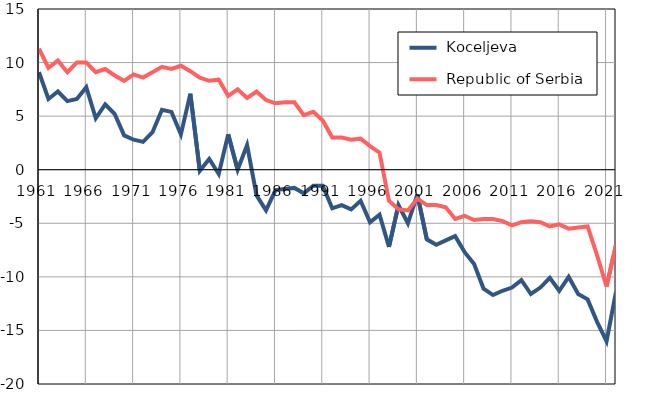
| Category |  Koceljeva |  Republic of Serbia |
|---|---|---|
| 1961.0 | 9.1 | 11.3 |
| 1962.0 | 6.6 | 9.5 |
| 1963.0 | 7.3 | 10.2 |
| 1964.0 | 6.4 | 9.1 |
| 1965.0 | 6.6 | 10 |
| 1966.0 | 7.7 | 10 |
| 1967.0 | 4.8 | 9.1 |
| 1968.0 | 6.1 | 9.4 |
| 1969.0 | 5.2 | 8.8 |
| 1970.0 | 3.2 | 8.3 |
| 1971.0 | 2.8 | 8.9 |
| 1972.0 | 2.6 | 8.6 |
| 1973.0 | 3.5 | 9.1 |
| 1974.0 | 5.6 | 9.6 |
| 1975.0 | 5.4 | 9.4 |
| 1976.0 | 3.3 | 9.7 |
| 1977.0 | 7.1 | 9.2 |
| 1978.0 | -0.1 | 8.6 |
| 1979.0 | 1 | 8.3 |
| 1980.0 | -0.4 | 8.4 |
| 1981.0 | 3.3 | 6.9 |
| 1982.0 | 0 | 7.5 |
| 1983.0 | 2.3 | 6.7 |
| 1984.0 | -2.4 | 7.3 |
| 1985.0 | -3.8 | 6.5 |
| 1986.0 | -1.9 | 6.2 |
| 1987.0 | -1.8 | 6.3 |
| 1988.0 | -1.7 | 6.3 |
| 1989.0 | -2.2 | 5.1 |
| 1990.0 | -1.5 | 5.4 |
| 1991.0 | -1.5 | 4.6 |
| 1992.0 | -3.6 | 3 |
| 1993.0 | -3.3 | 3 |
| 1994.0 | -3.7 | 2.8 |
| 1995.0 | -2.9 | 2.9 |
| 1996.0 | -4.9 | 2.2 |
| 1997.0 | -4.2 | 1.6 |
| 1998.0 | -7.2 | -2.9 |
| 1999.0 | -3.3 | -3.7 |
| 2000.0 | -5 | -3.8 |
| 2001.0 | -2.3 | -2.7 |
| 2002.0 | -6.5 | -3.3 |
| 2003.0 | -7 | -3.3 |
| 2004.0 | -6.6 | -3.5 |
| 2005.0 | -6.2 | -4.6 |
| 2006.0 | -7.7 | -4.3 |
| 2007.0 | -8.8 | -4.7 |
| 2008.0 | -11.1 | -4.6 |
| 2009.0 | -11.7 | -4.6 |
| 2010.0 | -11.3 | -4.8 |
| 2011.0 | -11 | -5.2 |
| 2012.0 | -10.3 | -4.9 |
| 2013.0 | -11.6 | -4.8 |
| 2014.0 | -11 | -4.9 |
| 2015.0 | -10.1 | -5.3 |
| 2016.0 | -11.3 | -5.1 |
| 2017.0 | -10 | -5.5 |
| 2018.0 | -11.6 | -5.4 |
| 2019.0 | -12.1 | -5.3 |
| 2020.0 | -14.2 | -8 |
| 2021.0 | -16 | -10.9 |
| 2022.0 | -11.4 | -7 |